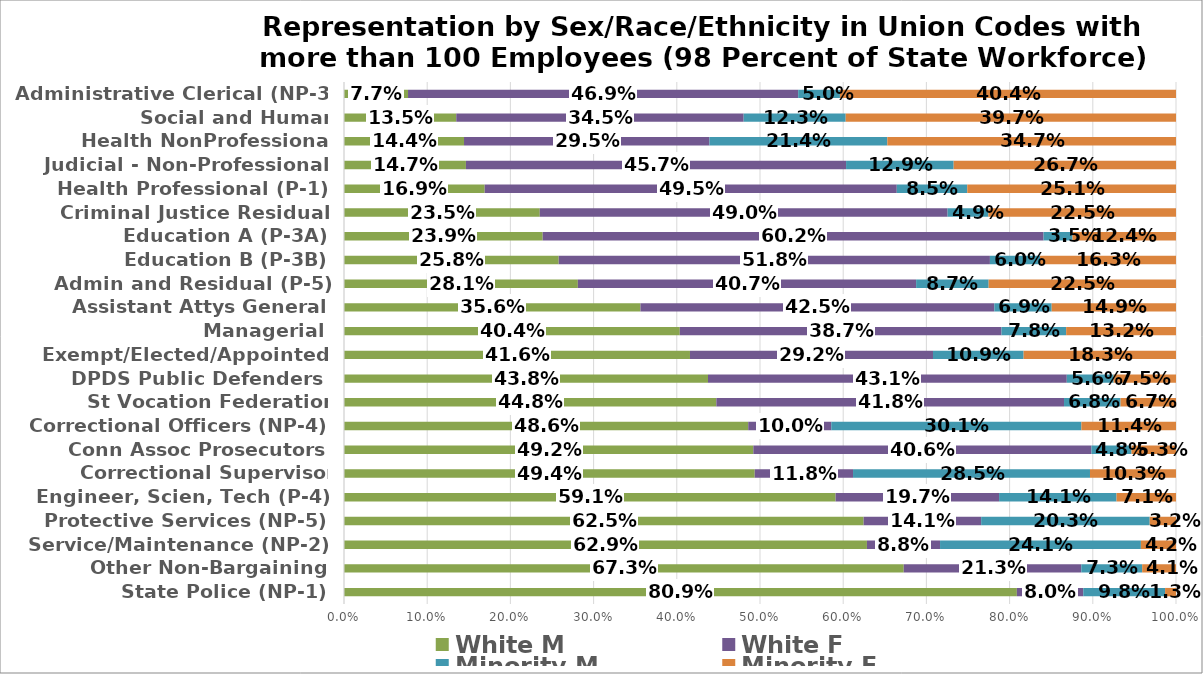
| Category | White M | White F | Minority M | Minority F |
|---|---|---|---|---|
| State Police (NP-1) | 0.809 | 0.08 | 0.098 | 0.013 |
| Other Non-Bargaining | 0.673 | 0.213 | 0.073 | 0.041 |
| Service/Maintenance (NP-2) | 0.629 | 0.088 | 0.241 | 0.042 |
| Protective Services (NP-5) | 0.625 | 0.141 | 0.203 | 0.032 |
| Engineer, Scien, Tech (P-4) | 0.591 | 0.197 | 0.141 | 0.071 |
| Correctional Supervisor (NP-8) | 0.494 | 0.118 | 0.285 | 0.103 |
| Conn Assoc Prosecutors | 0.492 | 0.406 | 0.048 | 0.053 |
| Correctional Officers (NP-4) | 0.486 | 0.1 | 0.301 | 0.114 |
| St Vocation Federation Teacher | 0.448 | 0.418 | 0.068 | 0.067 |
| DPDS Public Defenders - AFSCME | 0.438 | 0.431 | 0.056 | 0.075 |
| Exempt/Elected/Appointed | 0.416 | 0.292 | 0.109 | 0.183 |
| Managerial | 0.404 | 0.387 | 0.078 | 0.132 |
| Assistant Attys General | 0.356 | 0.425 | 0.069 | 0.149 |
| Admin and Residual (P-5) | 0.281 | 0.407 | 0.087 | 0.225 |
| Education B (P-3B) | 0.258 | 0.518 | 0.06 | 0.163 |
| Education A (P-3A) | 0.239 | 0.602 | 0.035 | 0.124 |
| Criminal Justice Residual | 0.235 | 0.49 | 0.049 | 0.225 |
| Health Professional (P-1) | 0.169 | 0.495 | 0.085 | 0.251 |
| Judicial - Non-Professional | 0.147 | 0.457 | 0.129 | 0.267 |
| Health NonProfessional (NP-6) | 0.144 | 0.295 | 0.214 | 0.347 |
| Social and Human Services(P-2) | 0.135 | 0.345 | 0.123 | 0.397 |
| Administrative Clerical (NP-3) | 0.077 | 0.469 | 0.05 | 0.404 |